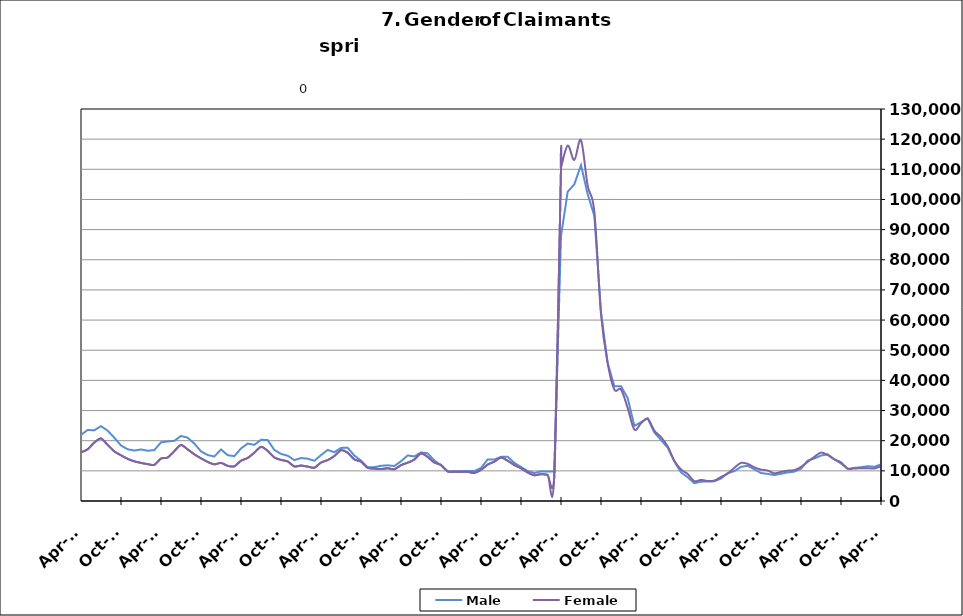
| Category | Male | Female |
|---|---|---|
| 1995-02-28 | 11910 | 7689 |
| 1995-03-31 | 12528 | 7887 |
| 1995-04-30 | 14119 | 8295 |
| 1995-05-31 | 15153 | 8659 |
| 1995-06-30 | 14654 | 9963 |
| 1995-07-31 | 16478 | 11435 |
| 1995-08-31 | 16264 | 11011 |
| 1995-09-30 | 13352 | 9104 |
| 1995-10-31 | 11499 | 8670 |
| 1995-11-30 | 10418 | 7960 |
| 1995-12-31 | 11010 | 7787 |
| 1996-01-31 | 11539 | 7863 |
| 1996-02-29 | 12768 | 7894 |
| 1996-03-31 | 13246 | 7755 |
| 1996-04-30 | 16021 | 8296 |
| 1996-05-31 | 15929 | 8751 |
| 1996-06-30 | 15291 | 10224 |
| 1996-07-31 | 17229 | 11535 |
| 1996-08-31 | 16317 | 10611 |
| 1996-09-30 | 13793 | 8812 |
| 1996-10-31 | 11431 | 8215 |
| 1996-11-30 | 10510 | 7751 |
| 1996-12-31 | 10023 | 7185 |
| 1997-01-31 | 12006 | 7404 |
| 1997-02-28 | 11976 | 7384 |
| 1997-03-31 | 11924 | 7078 |
| 1997-04-30 | 13098 | 7454 |
| 1997-05-31 | 13763 | 8032 |
| 1997-06-30 | 12872 | 9377 |
| 1997-07-31 | 15358 | 10550 |
| 1997-08-31 | 14888 | 9776 |
| 1997-09-30 | 12307 | 8016 |
| 1997-10-31 | 10749.5 | 7444 |
| 1997-11-30 | 9192 | 6872 |
| 1997-12-31 | 8541 | 6180 |
| 1998-01-31 | 9230 | 6563 |
| 1998-02-28 | 9286 | 6048 |
| 1998-03-31 | 9805 | 6012 |
| 1998-04-30 | 12254 | 7080 |
| 1998-05-31 | 13029 | 7509 |
| 1998-06-30 | 12376 | 9201 |
| 1998-07-31 | 14264 | 10448 |
| 1998-08-31 | 14319 | 9908 |
| 1998-09-30 | 12515 | 8202 |
| 1998-10-31 | 9927 | 7502 |
| 1998-11-30 | 9481 | 7563 |
| 1998-12-31 | 9422 | 7289 |
| 1999-01-31 | 10826 | 7829 |
| 1999-02-28 | 10614 | 7417 |
| 1999-03-31 | 10596 | 7180 |
| 1999-04-30 | 14139 | 8377 |
| 1999-05-31 | 14748 | 8508 |
| 1999-06-30 | 13399 | 9753 |
| 1999-07-31 | 16831 | 11294 |
| 1999-08-31 | 17466 | 10502 |
| 1999-09-30 | 14075 | 8356 |
| 1999-10-31 | 11344 | 7743 |
| 1999-11-30 | 10401 | 7623 |
| 1999-12-31 | 9702 | 6793 |
| 2000-01-31 | 10263 | 7252 |
| 2000-02-29 | 10217 | 7054 |
| 2000-03-31 | 10848 | 6860 |
| 2000-04-30 | 13099 | 8062 |
| 2000-05-31 | 13692 | 8388 |
| 2000-06-30 | 13498 | 10306 |
| 2000-07-31 | 15682 | 11874 |
| 2000-08-31 | 15407 | 10967 |
| 2000-09-30 | 12230 | 8808 |
| 2000-10-31 | 10182 | 8230 |
| 2000-11-30 | 9376 | 8049 |
| 2000-12-31 | 9229 | 7777 |
| 2001-01-31 | 10264 | 8400 |
| 2001-02-28 | 11709 | 8801 |
| 2001-03-31 | 9919 | 7036 |
| 2001-04-30 | 17255 | 11559 |
| 2001-05-31 | 18656 | 12219 |
| 2001-06-30 | 19590 | 15536 |
| 2001-07-31 | 22235 | 17388 |
| 2001-08-31 | 22550 | 16255 |
| 2001-09-30 | 20719 | 15193 |
| 2001-10-31 | 20761 | 15705 |
| 2001-11-30 | 22570 | 16084 |
| 2001-12-31 | 24429 | 16497 |
| 2002-01-31 | 26188 | 17125 |
| 2002-02-28 | 27071 | 16705 |
| 2002-03-31 | 26691 | 16475 |
| 2002-04-30 | 32125 | 20940 |
| 2002-05-31 | 31589 | 20115 |
| 2002-06-30 | 30220 | 21952 |
| 2002-07-31 | 30981 | 23132 |
| 2002-08-31 | 23858 | 16993 |
| 2002-09-30 | 27757 | 19832 |
| 2002-10-31 | 25023 | 18451 |
| 2002-11-30 | 24331 | 17763 |
| 2002-12-31 | 24361 | 17175 |
| 2003-01-31 | 24361 | 17175 |
| 2003-02-28 | 26133 | 17155 |
| 2003-03-31 | 26934 | 17491 |
| 2003-04-30 | 29393 | 19122 |
| 2003-05-31 | 30480 | 19811 |
| 2003-06-30 | 30177 | 22643 |
| 2003-07-31 | 30615 | 23565 |
| 2003-08-31 | 29860 | 22195 |
| 2003-09-30 | 26777 | 19925 |
| 2003-10-31 | 23899 | 18782 |
| 2003-11-30 | 22247 | 17944 |
| 2003-12-31 | 20902 | 16829 |
| 2004-01-31 | 20479 | 15794 |
| 2004-02-29 | 18869 | 14174 |
| 2004-03-31 | 18157 | 13452 |
| 2004-04-30 | 20525 | 14655 |
| 2004-05-31 | 20588 | 14975 |
| 2004-06-30 | 20148 | 17494 |
| 2004-07-31 | 22098 | 19064 |
| 2004-08-31 | 20778 | 16925 |
| 2004-09-30 | 17457 | 14258 |
| 2004-10-31 | 15548 | 13549 |
| 2004-11-30 | 14919 | 12836 |
| 2004-12-31 | 14200 | 11711 |
| 2005-01-31 | 14968 | 11918 |
| 2005-02-28 | 14478 | 11045 |
| 2005-03-31 | 13958 | 10426 |
| 2005-04-30 | 15898 | 11682 |
| 2005-05-31 | 16188 | 11900 |
| 2005-06-30 | 15549 | 14256 |
| 2005-07-31 | 16728 | 15274 |
| 2005-08-31 | 16418 | 13314 |
| 2005-09-30 | 12729 | 10857 |
| 2005-10-31 | 11493 | 10421 |
| 2005-11-30 | 10480 | 9638 |
| 2005-12-31 | 9482 | 8742 |
| 2006-01-31 | 9638 | 8761 |
| 2006-02-28 | 8844 | 7847 |
| 2006-03-31 | 9353 | 7709 |
| 2006-04-30 | 11916 | 9300 |
| 2006-05-31 | 12755 | 10017 |
| 2006-06-30 | 12840 | 12614 |
| 2006-07-31 | 14534 | 14007 |
| 2006-08-31 | 14510 | 12902 |
| 2006-09-30 | 12359 | 10850 |
| 2006-10-31 | 11360 | 10309 |
| 2006-11-30 | 10702 | 9403 |
| 2006-12-31 | 10886 | 9298 |
| 2007-01-31 | 11619 | 9539 |
| 2007-02-28 | 12137 | 9112 |
| 2007-03-31 | 12434 | 9125 |
| 2007-04-30 | 14864 | 10520 |
| 2007-05-31 | 16656 | 11730 |
| 2007-06-30 | 16711 | 14024 |
| 2007-07-31 | 18458 | 15882 |
| 2007-08-31 | 17879 | 14187 |
| 2007-09-30 | 16538 | 13586 |
| 2007-10-31 | 15458 | 13070 |
| 2007-11-15 | 14626 | 12172 |
| 2007-12-15 09:36:00 | 15625 | 12363 |
| 2008-01-14 19:12:00 | 17236 | 12936 |
| 2008-02-14 04:48:00 | 18262 | 12696 |
| 2008-03-15 14:24:00 | 19119 | 13263 |
| 2008-04-15 | 22039 | 15054 |
| 2008-05-15 09:36:00 | 24402 | 16733 |
| 2008-06-14 19:12:00 | 25155 | 19969 |
| 2008-07-15 04:48:00 | 27499 | 22268 |
| 2008-08-14 14:24:00 | 29286 | 21514 |
| 2008-09-14 | 30571 | 21776 |
| 2008-10-14 09:36:00 | 32282 | 22190 |
| 2008-11-13 19:12:00 | 36325 | 23395 |
| 2008-12-14 04:48:00 | 42012 | 25046 |
| 2009-01-13 14:24:00 | 49131 | 27148 |
| 2009-02-13 | 56509 | 29774 |
| 2009-03-15 09:36:00 | 63334 | 33788 |
| 2009-04-14 19:12:00 | 69062 | 36842 |
| 2009-05-15 04:48:00 | 69914 | 37773 |
| 2009-06-14 14:24:00 | 69512 | 42787 |
| 2009-07-15 | 71226 | 46347 |
| 2009-08-14 09:36:00 | 68777 | 43130 |
| 2009-09-13 19:12:00 | 65993 | 41526 |
| 2009-10-14 04:48:00 | 62480 | 40217 |
| 2009-11-13 14:24:00 | 60354 | 38454 |
| 2009-12-14 | 59507 | 36101 |
| 2010-01-13 09:36:00 | 58501 | 35014 |
| 2010-02-12 19:12:00 | 55590 | 32911 |
| 2010-03-15 04:48:00 | 53238 | 31883 |
| 2010-04-14 14:24:00 | 52264 | 32995 |
| 2010-05-15 | 50301 | 32394 |
| 2010-06-14 09:36:00 | 48130 | 36605 |
| 2010-07-14 19:12:00 | 48060 | 38748 |
| 2010-08-14 04:48:00 | 46311 | 35599 |
| 2010-09-13 14:24:00 | 41641 | 32453 |
| 2010-10-14 | 40403 | 32335 |
| 2010-11-13 09:36:00 | 38250 | 30275 |
| 2010-12-13 19:12:00 | 35858 | 26887 |
| 2011-01-13 04:48:00 | 37777 | 27522 |
| 2011-02-12 14:24:00 | 37515 | 26470 |
| 2011-03-15 | 35802 | 25248 |
| 2011-04-14 09:36:00 | 37452 | 26608 |
| 2011-05-14 19:12:00 | 37975 | 27212 |
| 2011-06-14 04:48:00 | 42289 | 36578 |
| 2011-07-14 14:24:00 | 42307 | 37061 |
| 2011-08-14 | 38125 | 31317 |
| 2011-09-13 09:36:00 | 34564 | 28090 |
| 2011-10-13 19:12:00 | 33146 | 27591 |
| 2011-11-13 04:48:00 | 31337 | 25538 |
| 2011-12-13 14:24:00 | 30334 | 23349 |
| 2012-01-13 | 31566 | 23385 |
| 2012-02-12 09:36:00 | 30859 | 22326 |
| 2012-03-13 19:12:00 | 29261 | 21568 |
| 2012-04-13 04:48:00 | 31494 | 22964 |
| 2012-05-13 14:24:00 | 32509 | 24284 |
| 2012-06-13 | 30900 | 27768 |
| 2012-07-13 09:36:00 | 33549 | 29756 |
| 2012-08-12 19:12:00 | 28663 | 24059 |
| 2012-09-12 04:48:00 | 25271 | 21482 |
| 2012-10-12 14:24:00 | 22730 | 20363 |
| 2012-11-12 | 19953 | 17450 |
| 2012-12-12 09:36:00 | 20635 | 16737 |
| 2013-01-11 19:12:00 | 22057 | 16712 |
| 2013-02-11 04:48:00 | 21486 | 15451 |
| 2013-03-13 14:24:00 | 20791 | 15186 |
| 2013-04-13 | 22409 | 16286 |
| 2013-05-13 09:36:00 | 24366 | 17794 |
| 2013-06-12 19:12:00 | 23573 | 20360 |
| 2013-07-13 04:48:00 | 25613 | 22369 |
| 2013-08-12 14:24:00 | 25420 | 20697 |
| 2013-09-12 | 22525 | 18385 |
| 2013-10-12 09:36:00 | 20848 | 17632 |
| 2013-11-11 19:12:00 | 20174 | 16466 |
| 2013-12-12 04:48:00 | 19765 | 15343 |
| 2014-01-11 14:24:00 | 20604 | 15183 |
| 2014-02-11 | 20864 | 15026 |
| 2014-03-13 09:36:00 | 21751 | 16343 |
| 2014-04-12 19:12:00 | 21948 | 16190 |
| 2014-05-13 04:48:00 | 23554 | 17163 |
| 2014-06-12 14:24:00 | 23446 | 19393 |
| 2014-07-13 | 24827 | 20751 |
| 2014-08-14 | 23315 | 18575 |
| 2014-09-13 09:36:00 | 20988 | 16453 |
| 2014-10-13 19:12:00 | 18411 | 15157 |
| 2014-11-13 04:48:00 | 17155 | 13975 |
| 2014-12-13 14:24:00 | 16727 | 13162 |
| 2015-01-13 | 17097 | 12633 |
| 2015-02-12 09:36:00 | 16674 | 12222 |
| 2015-03-14 19:12:00 | 16878 | 11988 |
| 2015-04-14 04:48:00 | 19448 | 14078 |
| 2015-05-14 14:24:00 | 19759 | 14413 |
| 2015-06-14 | 19952 | 16548 |
| 2015-07-14 09:36:00 | 21569 | 18572 |
| 2015-08-13 19:12:00 | 21001 | 17106 |
| 2015-09-13 04:48:00 | 19028 | 15475 |
| 2015-10-13 14:24:00 | 16459 | 14160 |
| 2015-11-13 | 15246 | 12968 |
| 2015-12-13 09:36:00 | 14756 | 12166 |
| 2016-01-12 19:12:00 | 17097 | 12633 |
| 2016-02-12 04:48:00 | 15198 | 11659 |
| 2016-03-13 14:24:00 | 14862 | 11506 |
| 2016-04-13 | 17432 | 13364 |
| 2016-05-13 09:36:00 | 19040 | 14264 |
| 2016-06-12 19:12:00 | 18628 | 16024 |
| 2016-07-13 04:48:00 | 20305 | 17959 |
| 2016-08-12 14:24:00 | 20204 | 16625 |
| 2016-09-12 | 16946 | 14443 |
| 2016-10-12 09:36:00 | 15612 | 13624 |
| 2016-11-11 19:12:00 | 15023 | 13122 |
| 2016-12-12 04:48:00 | 13560 | 11454 |
| 2017-01-11 14:24:00 | 14257 | 11754 |
| 2017-02-11 | 14028 | 11405 |
| 2017-03-13 09:36:00 | 13342 | 11038 |
| 2017-04-12 19:12:00 | 15225 | 12749 |
| 2017-05-13 04:48:00 | 16938 | 13582 |
| 2017-06-12 14:24:00 | 16188 | 14911 |
| 2017-07-13 | 17613 | 16845 |
| 2017-08-12 09:36:00 | 17640 | 16005 |
| 2017-09-11 19:12:00 | 15075 | 13806 |
| 2017-10-12 04:48:00 | 13384 | 13044 |
| 2017-11-11 14:24:00 | 11160 | 11015 |
| 2017-12-12 | 11238 | 10767 |
| 2018-01-11 09:36:00 | 11674 | 10594 |
| 2018-02-10 19:12:00 | 11835 | 10845 |
| 2018-03-13 04:48:00 | 11605 | 10548 |
| 2018-04-12 14:24:00 | 13162 | 11886 |
| 2018-05-13 | 15110 | 12712 |
| 2018-06-12 09:36:00 | 14782 | 13754 |
| 2018-07-12 19:12:00 | 16123 | 15773 |
| 2018-08-12 04:48:00 | 15808 | 14614 |
| 2018-09-11 14:24:00 | 13450 | 12761 |
| 2018-10-12 | 11831 | 11941 |
| 2018-11-11 09:36:00 | 9820 | 9821 |
| 2018-12-11 19:12:00 | 9649 | 9767 |
| 2019-01-11 04:48:00 | 9933 | 9654 |
| 2019-02-10 14:24:00 | 9925 | 9651 |
| 2019-03-13 | 9922 | 9318 |
| 2019-04-12 09:36:00 | 10950 | 10320 |
| 2019-05-12 19:12:00 | 13782 | 12072 |
| 2019-06-12 04:48:00 | 13767 | 13063 |
| 2019-07-12 14:24:00 | 14644 | 14409 |
| 2019-08-12 | 14678 | 13343 |
| 2019-09-11 09:36:00 | 12637 | 11915 |
| 2019-10-11 19:12:00 | 11254 | 10847 |
| 2019-11-11 04:48:00 | 9954 | 9467 |
| 2019-12-11 14:24:00 | 9289 | 8549 |
| 2020-01-11 | 9815 | 8911 |
| 2020-02-10 09:36:00 | 9754 | 8723 |
| 2020-03-11 19:12:00 | 9805 | 8802 |
| 2020-04-11 04:48:00 | 87837 | 110534 |
| 2020-05-11 14:24:00 | 102538 | 117856 |
| 2020-06-11 | 105039 | 113108 |
| 2020-07-11 09:36:00 | 111386 | 119644 |
| 2020-08-10 19:12:00 | 101758 | 104593 |
| 2020-09-10 04:48:00 | 94558 | 95979 |
| 2020-10-10 14:24:00 | 62680 | 62005 |
| 2020-11-10 | 45770 | 45707 |
| 2020-12-10 09:36:00 | 38071 | 36983 |
| 2021-01-09 19:12:00 | 38071 | 36983 |
| 2021-02-09 04:48:00 | 34126 | 30845 |
| 2021-03-11 14:24:00 | 24924 | 23717 |
| 2021-04-11 | 26116 | 25767 |
| 2021-05-11 09:36:00 | 27432 | 27279 |
| 2021-06-10 19:12:00 | 22711 | 23336 |
| 2021-07-11 04:48:00 | 20218 | 21201 |
| 2021-08-10 14:24:00 | 17708 | 18105 |
| 2021-09-10 | 13157 | 13319 |
| 2021-10-10 09:36:00 | 9494 | 10478 |
| 2021-11-09 19:12:00 | 7871 | 8942 |
| 2021-12-10 04:48:00 | 5889 | 6585 |
| 2022-01-09 14:24:00 | 6421 | 6988 |
| 2022-02-09 | 6439 | 6634 |
| 2022-03-11 09:36:00 | 6526 | 6780 |
| 2022-04-10 19:12:00 | 7456 | 7968 |
| 2022-05-11 04:48:00 | 9208 | 9103 |
| 2022-06-10 14:24:00 | 9908 | 11010 |
| 2022-07-11 | 11333 | 12637 |
| 2022-08-10 09:36:00 | 11684 | 12302 |
| 2022-09-09 19:12:00 | 10505 | 11164 |
| 2022-10-10 04:48:00 | 9269 | 10405 |
| 2022-11-09 14:24:00 | 8987 | 10105 |
| 2022-12-10 | 8606 | 9206 |
| 2023-01-09 09:36:00 | 9039 | 9648 |
| 2023-02-08 19:12:00 | 9477 | 10063 |
| 2023-03-11 04:48:00 | 9741 | 10250 |
| 2023-04-10 14:24:00 | 10705 | 11285 |
| 2023-05-11 | 13400 | 12988 |
| 2023-06-10 09:36:00 | 14103 | 14625 |
| 2023-07-10 19:12:00 | 15060 | 16045 |
| 2023-08-10 04:48:00 | 15475 | 15264 |
| 2023-09-09 14:24:00 | 13817 | 13818 |
| 2023-10-10 | 12438 | 12818 |
| 2023-11-09 09:36:00 | 10634 | 10753 |
| 2023-12-09 19:12:00 | 10984 | 10791 |
| 2024-01-09 04:48:00 | 11193 | 10858 |
| 2024-02-08 14:24:00 | 11545 | 10894 |
| 2024-03-10 | 11349 | 10787 |
| 2024-04-09 09:36:00 | 12151 | 11575 |